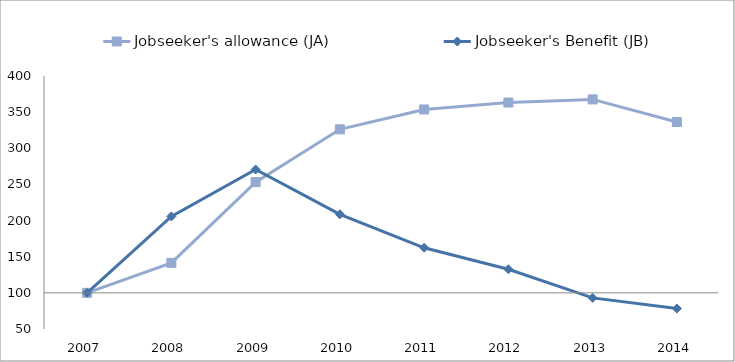
| Category | Jobseeker's allowance (JA) | Jobseeker's Benefit (JB) | 0 |
|---|---|---|---|
| 2007.0 | 100 | 100 |  |
| 2008.0 | 141.53 | 205.795 |  |
| 2009.0 | 253.212 | 270.627 |  |
| 2010.0 | 326.22 | 208.659 |  |
| 2011.0 | 353.726 | 162.327 |  |
| 2012.0 | 363.333 | 132.606 |  |
| 2013.0 | 367.615 | 93.072 |  |
| 2014.0 | 336.312 | 78.312 |  |